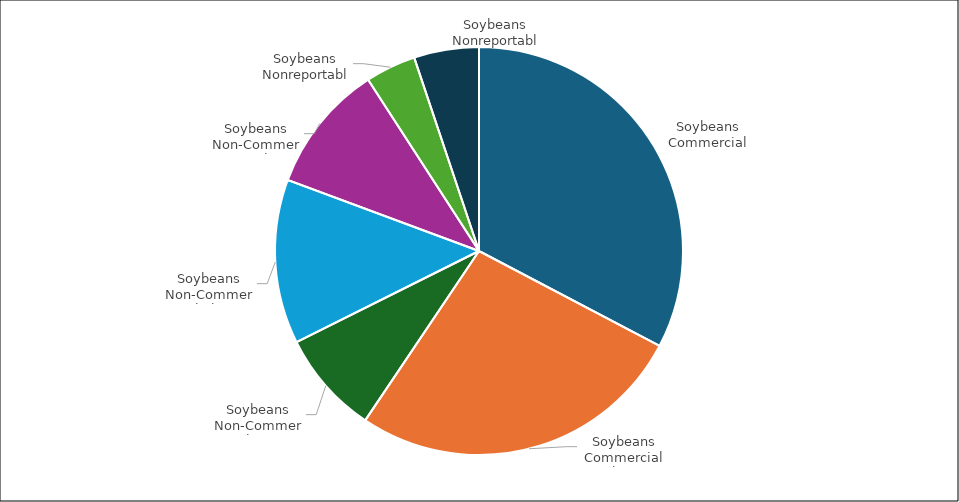
| Category | Series 0 |
|---|---|
| Soybeans Commercial Long | 0.593 |
| Soybeans Commercial Short | 0.485 |
| Soybeans Non-Commercial Long | 0.149 |
| Soybeans Non-Commercial Short | 0.237 |
| Soybeans Non-Commercial Spreading | 0.185 |
| Soybeans Nonreportable Long | 0.073 |
| Soybeans Nonreportable Short | 0.093 |